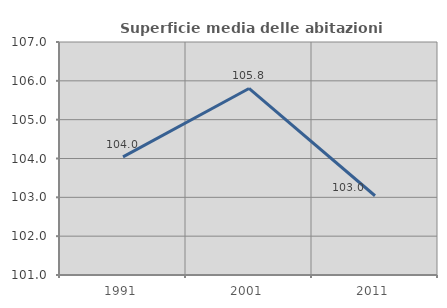
| Category | Superficie media delle abitazioni occupate |
|---|---|
| 1991.0 | 104.043 |
| 2001.0 | 105.804 |
| 2011.0 | 103.041 |